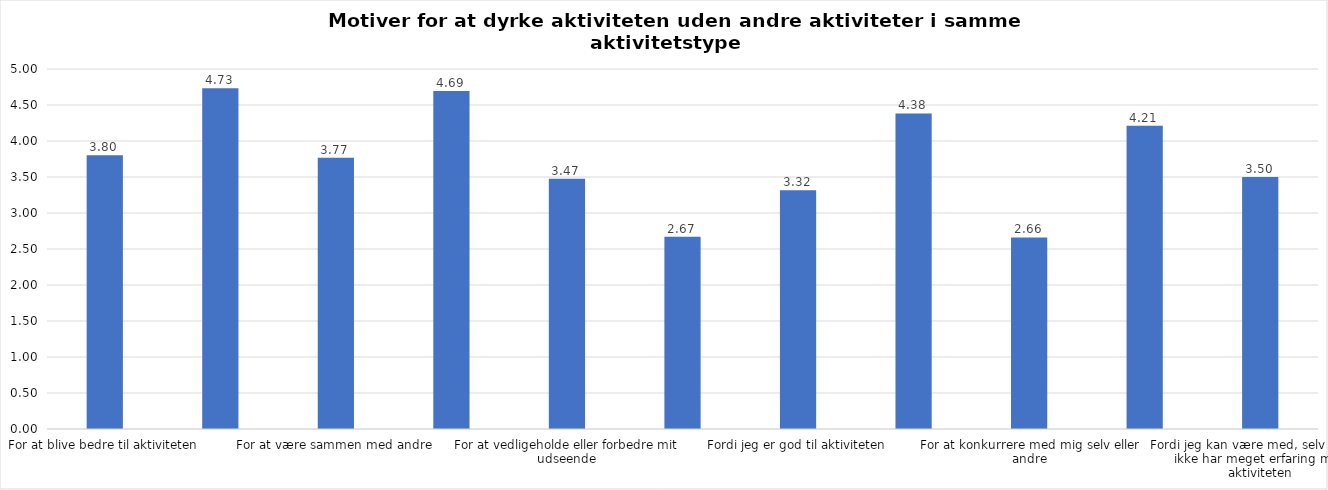
| Category | Gennemsnit |
|---|---|
| For at blive bedre til aktiviteten | 3.801 |
| For at vedligeholde eller forbedre min sundhed (fx helbred, fysisk form) | 4.732 |
| For at være sammen med andre | 3.769 |
| For at gøre noget godt for mig selv | 4.694 |
| For at vedligeholde eller forbedre mit udseende | 3.474 |
| Fordi andre i min omgangskreds opmuntrer mig til det | 2.672 |
| Fordi jeg er god til aktiviteten | 3.317 |
| Fordi jeg godt kan lide aktiviteten | 4.382 |
| For at konkurrere med mig selv eller andre | 2.661 |
| Fordi aktiviteten passer godt ind i min hverdag | 4.213 |
| Fordi jeg kan være med, selv om jeg ikke har meget erfaring med aktiviteten | 3.501 |